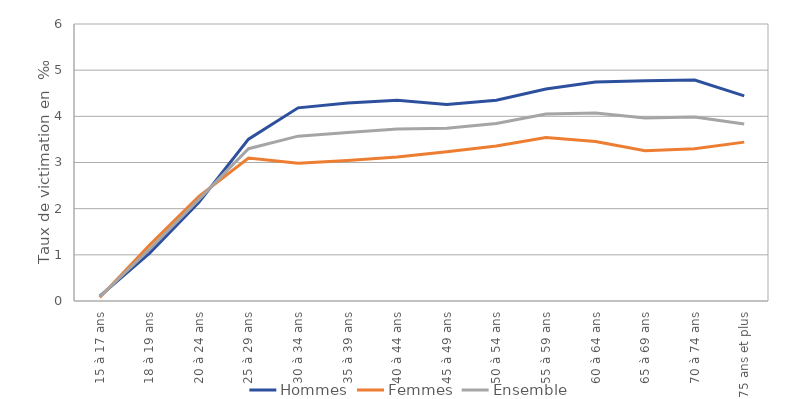
| Category | Hommes | Femmes | Ensemble |
|---|---|---|---|
| 15 à 17 ans | 0.104 | 0.078 | 0.091 |
| 18 à 19 ans | 1.033 | 1.206 | 1.117 |
| 20 à 24 ans | 2.139 | 2.267 | 2.202 |
| 25 à 29 ans | 3.505 | 3.096 | 3.299 |
| 30 à 34 ans | 4.184 | 2.986 | 3.57 |
| 35 à 39 ans | 4.287 | 3.042 | 3.649 |
| 40 à 44 ans | 4.346 | 3.121 | 3.724 |
| 45 à 49 ans | 4.257 | 3.234 | 3.741 |
| 50 à 54 ans | 4.348 | 3.356 | 3.845 |
| 55 à 59 ans | 4.591 | 3.54 | 4.051 |
| 60 à 64 ans | 4.744 | 3.456 | 4.071 |
| 65 à 69 ans | 4.77 | 3.255 | 3.965 |
| 70 à 74 ans | 4.788 | 3.297 | 3.987 |
| 75 ans et plus | 4.443 | 3.441 | 3.832 |